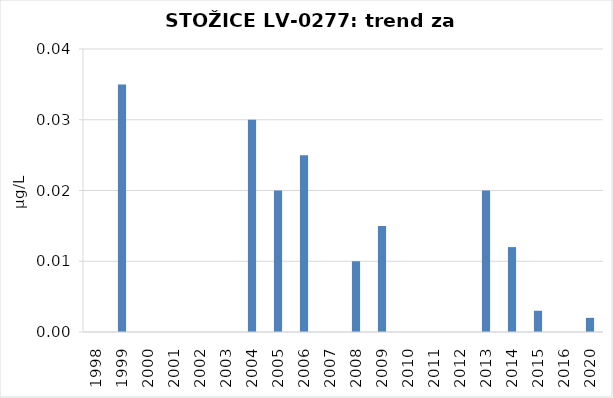
| Category | Vsota |
|---|---|
| 1998 | 0 |
| 1999 | 0.035 |
| 2000 | 0 |
| 2001 | 0 |
| 2002 | 0 |
| 2003 | 0 |
| 2004 | 0.03 |
| 2005 | 0.02 |
| 2006 | 0.025 |
| 2007 | 0 |
| 2008 | 0.01 |
| 2009 | 0.015 |
| 2010 | 0 |
| 2011 | 0 |
| 2012 | 0 |
| 2013 | 0.02 |
| 2014 | 0.012 |
| 2015 | 0.003 |
| 2016 | 0 |
| 2020 | 0.002 |